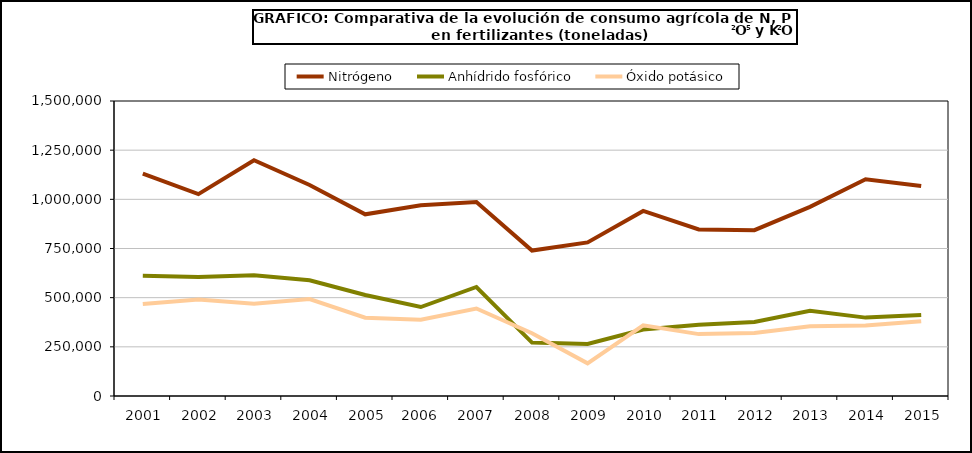
| Category | Nitrógeno | Anhídrido fosfórico | Óxido potásico |
|---|---|---|---|
|   2001 | 1131006 | 610838 | 468360 |
|   2002 | 1026546 | 605224 | 491138 |
|   2003 | 1198606 | 614385 | 468511 |
|   2004 | 1072949 | 588820 | 492571 |
|   2005 | 923764 | 513454 | 398230 |
|   2006  | 969783 | 452461 | 388187 |
|   2007  | 985857 | 554382 | 444853 |
|   2008 | 739757 | 271578 | 319194 |
|   2009 | 781069 | 264211 | 166016 |
|   2010 | 940984 | 337812 | 359583 |
|   2011 | 846697 | 362672 | 314642 |
|   2012 | 843410 | 376590 | 320841 |
|   2013 | 961507 | 432904 | 354738 |
|   2014 | 1101895 | 398580 | 357875 |
|   2015 | 1068103 | 411763 | 380303 |